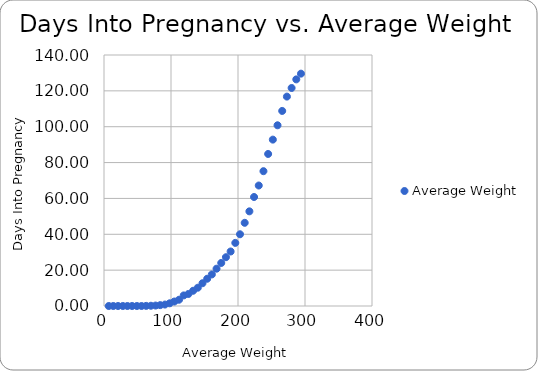
| Category | Average Weight |
|---|---|
| 7.0 | 0 |
| 14.0 | 0 |
| 21.0 | 0 |
| 28.0 | 0 |
| 35.0 | 0 |
| 42.0 | 0 |
| 49.0 | 0 |
| 56.0 | 0 |
| 63.0 | 0.07 |
| 70.0 | 0.14 |
| 77.0 | 0.25 |
| 84.0 | 0.49 |
| 91.0 | 0.81 |
| 98.0 | 1.5 |
| 105.0 | 2.5 |
| 112.0 | 3.5 |
| 119.0 | 5.9 |
| 126.0 | 6.7 |
| 133.0 | 8.5 |
| 140.0 | 10.2 |
| 147.0 | 12.7 |
| 154.0 | 15.2 |
| 161.0 | 17.6 |
| 168.0 | 20.8 |
| 175.0 | 24 |
| 182.0 | 27.2 |
| 189.0 | 30.4 |
| 196.0 | 35.2 |
| 203.0 | 40 |
| 210.0 | 46.4 |
| 217.0 | 52.8 |
| 224.0 | 60.8 |
| 231.0 | 67.2 |
| 238.0 | 75.2 |
| 245.0 | 84.8 |
| 252.0 | 92.8 |
| 259.0 | 100.8 |
| 266.0 | 108.8 |
| 273.0 | 116.8 |
| 280.0 | 121.6 |
| 287.0 | 126.4 |
| 294.0 | 129.6 |